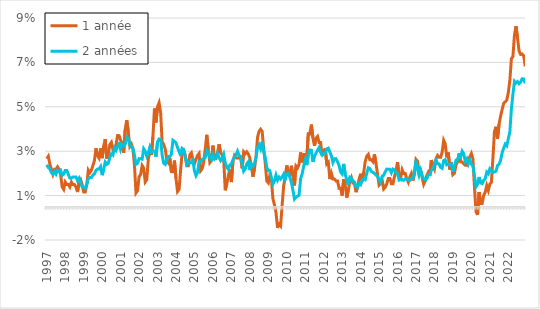
| Category | 1 année | 2 années |
|---|---|---|
| 1997-01-01 | 0.022 | 0.019 |
| 1997-02-01 | 0.023 | 0.018 |
| 1997-03-01 | 0.019 | 0.017 |
| 1997-04-01 | 0.017 | 0.015 |
| 1997-05-01 | 0.015 | 0.015 |
| 1997-06-01 | 0.017 | 0.016 |
| 1997-07-01 | 0.017 | 0.015 |
| 1997-08-01 | 0.018 | 0.016 |
| 1997-09-01 | 0.017 | 0.016 |
| 1997-10-01 | 0.015 | 0.016 |
| 1997-11-01 | 0.009 | 0.014 |
| 1997-12-01 | 0.008 | 0.015 |
| 1998-01-01 | 0.011 | 0.016 |
| 1998-02-01 | 0.01 | 0.016 |
| 1998-03-01 | 0.01 | 0.015 |
| 1998-04-01 | 0.009 | 0.013 |
| 1998-05-01 | 0.011 | 0.013 |
| 1998-06-01 | 0.01 | 0.013 |
| 1998-07-01 | 0.01 | 0.013 |
| 1998-08-01 | 0.009 | 0.013 |
| 1998-09-01 | 0.007 | 0.012 |
| 1998-10-01 | 0.011 | 0.013 |
| 1998-11-01 | 0.012 | 0.011 |
| 1998-12-01 | 0.01 | 0.009 |
| 1999-01-01 | 0.007 | 0.009 |
| 1999-02-01 | 0.007 | 0.008 |
| 1999-03-01 | 0.01 | 0.01 |
| 1999-04-01 | 0.016 | 0.013 |
| 1999-05-01 | 0.015 | 0.013 |
| 1999-06-01 | 0.016 | 0.013 |
| 1999-07-01 | 0.019 | 0.014 |
| 1999-08-01 | 0.021 | 0.015 |
| 1999-09-01 | 0.026 | 0.016 |
| 1999-10-01 | 0.023 | 0.017 |
| 1999-11-01 | 0.022 | 0.017 |
| 1999-12-01 | 0.026 | 0.018 |
| 2000-01-01 | 0.022 | 0.014 |
| 2000-02-01 | 0.027 | 0.017 |
| 2000-03-01 | 0.03 | 0.02 |
| 2000-04-01 | 0.022 | 0.019 |
| 2000-05-01 | 0.024 | 0.02 |
| 2000-06-01 | 0.028 | 0.022 |
| 2000-07-01 | 0.029 | 0.024 |
| 2000-08-01 | 0.026 | 0.023 |
| 2000-09-01 | 0.027 | 0.027 |
| 2000-10-01 | 0.028 | 0.025 |
| 2000-11-01 | 0.032 | 0.027 |
| 2000-12-01 | 0.032 | 0.029 |
| 2001-01-01 | 0.03 | 0.026 |
| 2001-02-01 | 0.029 | 0.028 |
| 2001-03-01 | 0.024 | 0.027 |
| 2001-04-01 | 0.035 | 0.028 |
| 2001-05-01 | 0.039 | 0.031 |
| 2001-06-01 | 0.034 | 0.031 |
| 2001-07-01 | 0.027 | 0.028 |
| 2001-08-01 | 0.028 | 0.027 |
| 2001-09-01 | 0.026 | 0.026 |
| 2001-10-01 | 0.019 | 0.023 |
| 2001-11-01 | 0.006 | 0.019 |
| 2001-12-01 | 0.007 | 0.02 |
| 2002-01-01 | 0.013 | 0.022 |
| 2002-02-01 | 0.014 | 0.022 |
| 2002-03-01 | 0.019 | 0.021 |
| 2002-04-01 | 0.017 | 0.026 |
| 2002-05-01 | 0.011 | 0.025 |
| 2002-06-01 | 0.012 | 0.023 |
| 2002-07-01 | 0.021 | 0.024 |
| 2002-08-01 | 0.025 | 0.027 |
| 2002-09-01 | 0.023 | 0.025 |
| 2002-10-01 | 0.032 | 0.025 |
| 2002-11-01 | 0.044 | 0.025 |
| 2002-12-01 | 0.038 | 0.022 |
| 2003-01-01 | 0.045 | 0.029 |
| 2003-02-01 | 0.047 | 0.031 |
| 2003-03-01 | 0.042 | 0.03 |
| 2003-04-01 | 0.029 | 0.023 |
| 2003-05-01 | 0.028 | 0.02 |
| 2003-06-01 | 0.026 | 0.019 |
| 2003-07-01 | 0.021 | 0.021 |
| 2003-08-01 | 0.02 | 0.023 |
| 2003-09-01 | 0.022 | 0.023 |
| 2003-10-01 | 0.016 | 0.024 |
| 2003-11-01 | 0.016 | 0.03 |
| 2003-12-01 | 0.021 | 0.029 |
| 2004-01-01 | 0.013 | 0.029 |
| 2004-02-01 | 0.007 | 0.027 |
| 2004-03-01 | 0.008 | 0.025 |
| 2004-04-01 | 0.017 | 0.023 |
| 2004-05-01 | 0.024 | 0.026 |
| 2004-06-01 | 0.025 | 0.026 |
| 2004-07-01 | 0.023 | 0.022 |
| 2004-08-01 | 0.018 | 0.019 |
| 2004-09-01 | 0.018 | 0.02 |
| 2004-10-01 | 0.023 | 0.02 |
| 2004-11-01 | 0.024 | 0.02 |
| 2004-12-01 | 0.021 | 0.021 |
| 2005-01-01 | 0.019 | 0.016 |
| 2005-02-01 | 0.021 | 0.014 |
| 2005-03-01 | 0.023 | 0.015 |
| 2005-04-01 | 0.024 | 0.02 |
| 2005-05-01 | 0.016 | 0.02 |
| 2005-06-01 | 0.017 | 0.021 |
| 2005-07-01 | 0.02 | 0.022 |
| 2005-08-01 | 0.026 | 0.022 |
| 2005-09-01 | 0.032 | 0.025 |
| 2005-10-01 | 0.026 | 0.025 |
| 2005-11-01 | 0.02 | 0.022 |
| 2005-12-01 | 0.021 | 0.021 |
| 2006-01-01 | 0.028 | 0.023 |
| 2006-02-01 | 0.022 | 0.022 |
| 2006-03-01 | 0.022 | 0.022 |
| 2006-04-01 | 0.024 | 0.024 |
| 2006-05-01 | 0.028 | 0.022 |
| 2006-06-01 | 0.024 | 0.021 |
| 2006-07-01 | 0.023 | 0.022 |
| 2006-08-01 | 0.021 | 0.024 |
| 2006-09-01 | 0.007 | 0.02 |
| 2006-10-01 | 0.01 | 0.018 |
| 2006-11-01 | 0.014 | 0.017 |
| 2006-12-01 | 0.017 | 0.019 |
| 2007-01-01 | 0.011 | 0.019 |
| 2007-02-01 | 0.02 | 0.021 |
| 2007-03-01 | 0.023 | 0.022 |
| 2007-04-01 | 0.022 | 0.023 |
| 2007-05-01 | 0.022 | 0.025 |
| 2007-06-01 | 0.022 | 0.023 |
| 2007-07-01 | 0.022 | 0.023 |
| 2007-08-01 | 0.017 | 0.019 |
| 2007-09-01 | 0.025 | 0.016 |
| 2007-10-01 | 0.024 | 0.017 |
| 2007-11-01 | 0.025 | 0.019 |
| 2007-12-01 | 0.024 | 0.02 |
| 2008-01-01 | 0.022 | 0.016 |
| 2008-02-01 | 0.018 | 0.019 |
| 2008-03-01 | 0.014 | 0.018 |
| 2008-04-01 | 0.017 | 0.019 |
| 2008-05-01 | 0.022 | 0.022 |
| 2008-06-01 | 0.031 | 0.027 |
| 2008-07-01 | 0.034 | 0.028 |
| 2008-08-01 | 0.035 | 0.026 |
| 2008-09-01 | 0.034 | 0.029 |
| 2008-10-01 | 0.026 | 0.025 |
| 2008-11-01 | 0.02 | 0.022 |
| 2008-12-01 | 0.012 | 0.018 |
| 2009-01-01 | 0.011 | 0.016 |
| 2009-02-01 | 0.014 | 0.016 |
| 2009-03-01 | 0.012 | 0.013 |
| 2009-04-01 | 0.004 | 0.01 |
| 2009-05-01 | 0.001 | 0.012 |
| 2009-06-01 | -0.003 | 0.014 |
| 2009-07-01 | -0.009 | 0.012 |
| 2009-08-01 | -0.008 | 0.013 |
| 2009-09-01 | -0.009 | 0.012 |
| 2009-10-01 | 0.001 | 0.013 |
| 2009-11-01 | 0.01 | 0.015 |
| 2009-12-01 | 0.013 | 0.012 |
| 2010-01-01 | 0.019 | 0.015 |
| 2010-02-01 | 0.016 | 0.015 |
| 2010-03-01 | 0.014 | 0.013 |
| 2010-04-01 | 0.018 | 0.011 |
| 2010-05-01 | 0.014 | 0.007 |
| 2010-06-01 | 0.01 | 0.003 |
| 2010-07-01 | 0.018 | 0.004 |
| 2010-08-01 | 0.017 | 0.005 |
| 2010-09-01 | 0.019 | 0.005 |
| 2010-10-01 | 0.024 | 0.013 |
| 2010-11-01 | 0.02 | 0.015 |
| 2010-12-01 | 0.024 | 0.018 |
| 2011-01-01 | 0.023 | 0.021 |
| 2011-02-01 | 0.022 | 0.019 |
| 2011-03-01 | 0.033 | 0.023 |
| 2011-04-01 | 0.033 | 0.026 |
| 2011-05-01 | 0.037 | 0.025 |
| 2011-06-01 | 0.031 | 0.02 |
| 2011-07-01 | 0.027 | 0.023 |
| 2011-08-01 | 0.031 | 0.024 |
| 2011-09-01 | 0.032 | 0.025 |
| 2011-10-01 | 0.029 | 0.027 |
| 2011-11-01 | 0.029 | 0.024 |
| 2011-12-01 | 0.023 | 0.023 |
| 2012-01-01 | 0.025 | 0.024 |
| 2012-02-01 | 0.026 | 0.024 |
| 2012-03-01 | 0.019 | 0.026 |
| 2012-04-01 | 0.02 | 0.026 |
| 2012-05-01 | 0.012 | 0.025 |
| 2012-06-01 | 0.015 | 0.023 |
| 2012-07-01 | 0.012 | 0.02 |
| 2012-08-01 | 0.012 | 0.022 |
| 2012-09-01 | 0.012 | 0.022 |
| 2012-10-01 | 0.012 | 0.02 |
| 2012-11-01 | 0.008 | 0.019 |
| 2012-12-01 | 0.008 | 0.016 |
| 2013-01-01 | 0.005 | 0.015 |
| 2013-02-01 | 0.012 | 0.019 |
| 2013-03-01 | 0.01 | 0.015 |
| 2013-04-01 | 0.004 | 0.012 |
| 2013-05-01 | 0.007 | 0.01 |
| 2013-06-01 | 0.012 | 0.013 |
| 2013-07-01 | 0.013 | 0.013 |
| 2013-08-01 | 0.011 | 0.012 |
| 2013-09-01 | 0.011 | 0.011 |
| 2013-10-01 | 0.007 | 0.009 |
| 2013-11-01 | 0.009 | 0.009 |
| 2013-12-01 | 0.012 | 0.01 |
| 2014-01-01 | 0.015 | 0.01 |
| 2014-02-01 | 0.011 | 0.012 |
| 2014-03-01 | 0.015 | 0.013 |
| 2014-04-01 | 0.02 | 0.012 |
| 2014-05-01 | 0.023 | 0.015 |
| 2014-06-01 | 0.024 | 0.018 |
| 2014-07-01 | 0.021 | 0.017 |
| 2014-08-01 | 0.021 | 0.016 |
| 2014-09-01 | 0.02 | 0.015 |
| 2014-10-01 | 0.024 | 0.015 |
| 2014-11-01 | 0.02 | 0.014 |
| 2014-12-01 | 0.015 | 0.014 |
| 2015-01-01 | 0.01 | 0.012 |
| 2015-02-01 | 0.01 | 0.011 |
| 2015-03-01 | 0.012 | 0.014 |
| 2015-04-01 | 0.008 | 0.014 |
| 2015-05-01 | 0.009 | 0.016 |
| 2015-06-01 | 0.01 | 0.017 |
| 2015-07-01 | 0.013 | 0.017 |
| 2015-08-01 | 0.013 | 0.017 |
| 2015-09-01 | 0.01 | 0.015 |
| 2015-10-01 | 0.01 | 0.017 |
| 2015-11-01 | 0.014 | 0.017 |
| 2015-12-01 | 0.016 | 0.015 |
| 2016-01-01 | 0.02 | 0.015 |
| 2016-02-01 | 0.014 | 0.012 |
| 2016-03-01 | 0.013 | 0.012 |
| 2016-04-01 | 0.017 | 0.012 |
| 2016-05-01 | 0.015 | 0.012 |
| 2016-06-01 | 0.015 | 0.013 |
| 2016-07-01 | 0.013 | 0.013 |
| 2016-08-01 | 0.011 | 0.012 |
| 2016-09-01 | 0.013 | 0.012 |
| 2016-10-01 | 0.015 | 0.013 |
| 2016-11-01 | 0.012 | 0.013 |
| 2016-12-01 | 0.015 | 0.016 |
| 2017-01-01 | 0.021 | 0.021 |
| 2017-02-01 | 0.02 | 0.017 |
| 2017-03-01 | 0.016 | 0.014 |
| 2017-04-01 | 0.016 | 0.017 |
| 2017-05-01 | 0.013 | 0.014 |
| 2017-06-01 | 0.01 | 0.013 |
| 2017-07-01 | 0.012 | 0.012 |
| 2017-08-01 | 0.014 | 0.012 |
| 2017-09-01 | 0.016 | 0.014 |
| 2017-10-01 | 0.014 | 0.014 |
| 2017-11-01 | 0.021 | 0.016 |
| 2017-12-01 | 0.019 | 0.017 |
| 2018-01-01 | 0.017 | 0.019 |
| 2018-02-01 | 0.022 | 0.021 |
| 2018-03-01 | 0.023 | 0.019 |
| 2018-04-01 | 0.022 | 0.019 |
| 2018-05-01 | 0.022 | 0.018 |
| 2018-06-01 | 0.025 | 0.017 |
| 2018-07-01 | 0.03 | 0.021 |
| 2018-08-01 | 0.028 | 0.021 |
| 2018-09-01 | 0.022 | 0.019 |
| 2018-10-01 | 0.024 | 0.019 |
| 2018-11-01 | 0.017 | 0.019 |
| 2018-12-01 | 0.02 | 0.019 |
| 2019-01-01 | 0.014 | 0.016 |
| 2019-02-01 | 0.015 | 0.018 |
| 2019-03-01 | 0.019 | 0.021 |
| 2019-04-01 | 0.02 | 0.021 |
| 2019-05-01 | 0.024 | 0.023 |
| 2019-06-01 | 0.02 | 0.022 |
| 2019-07-01 | 0.02 | 0.025 |
| 2019-08-01 | 0.019 | 0.024 |
| 2019-09-01 | 0.019 | 0.02 |
| 2019-10-01 | 0.019 | 0.022 |
| 2019-11-01 | 0.022 | 0.019 |
| 2019-12-01 | 0.022 | 0.021 |
| 2020-01-01 | 0.024 | 0.019 |
| 2020-02-01 | 0.022 | 0.018 |
| 2020-03-01 | 0.009 | 0.014 |
| 2020-04-01 | -0.002 | 0.009 |
| 2020-05-01 | -0.004 | 0.01 |
| 2020-06-01 | 0.007 | 0.013 |
| 2020-07-01 | 0.001 | 0.011 |
| 2020-08-01 | 0.001 | 0.01 |
| 2020-09-01 | 0.005 | 0.012 |
| 2020-10-01 | 0.007 | 0.013 |
| 2020-11-01 | 0.01 | 0.016 |
| 2020-12-01 | 0.007 | 0.015 |
| 2021-01-01 | 0.01 | 0.017 |
| 2021-02-01 | 0.011 | 0.016 |
| 2021-03-01 | 0.022 | 0.015 |
| 2021-04-01 | 0.034 | 0.016 |
| 2021-05-01 | 0.036 | 0.016 |
| 2021-06-01 | 0.031 | 0.019 |
| 2021-07-01 | 0.037 | 0.019 |
| 2021-08-01 | 0.041 | 0.021 |
| 2021-09-01 | 0.044 | 0.024 |
| 2021-10-01 | 0.047 | 0.026 |
| 2021-11-01 | 0.047 | 0.028 |
| 2021-12-01 | 0.048 | 0.027 |
| 2022-01-01 | 0.051 | 0.031 |
| 2022-02-01 | 0.057 | 0.034 |
| 2022-03-01 | 0.067 | 0.044 |
| 2022-04-01 | 0.068 | 0.051 |
| 2022-05-01 | 0.077 | 0.056 |
| 2022-06-01 | 0.081 | 0.056 |
| 2022-07-01 | 0.076 | 0.056 |
| 2022-08-01 | 0.07 | 0.055 |
| 2022-09-01 | 0.069 | 0.056 |
| 2022-10-01 | 0.069 | 0.058 |
| 2022-11-01 | 0.068 | 0.058 |
| 2022-12-01 | 0.063 | 0.056 |